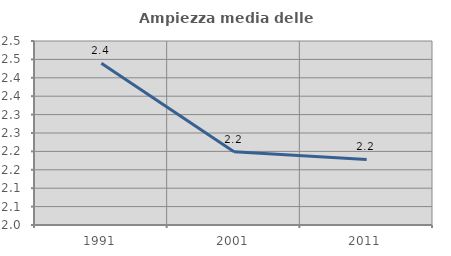
| Category | Ampiezza media delle famiglie |
|---|---|
| 1991.0 | 2.44 |
| 2001.0 | 2.199 |
| 2011.0 | 2.178 |